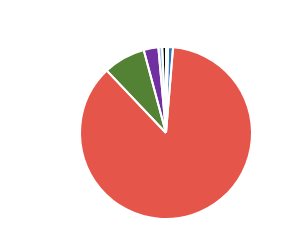
| Category | Series 0 |
|---|---|
| PC | 536 |
| MC | 1311 |
| CAR | 121890 |
| LGV | 11125 |
| OGV1 | 3876 |
| OGV2 | 1019 |
| PSV | 982 |